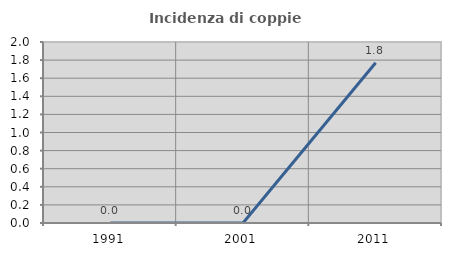
| Category | Incidenza di coppie miste |
|---|---|
| 1991.0 | 0 |
| 2001.0 | 0 |
| 2011.0 | 1.77 |